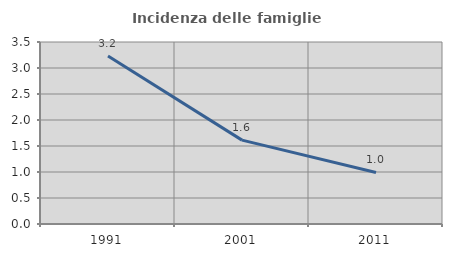
| Category | Incidenza delle famiglie numerose |
|---|---|
| 1991.0 | 3.23 |
| 2001.0 | 1.613 |
| 2011.0 | 0.992 |